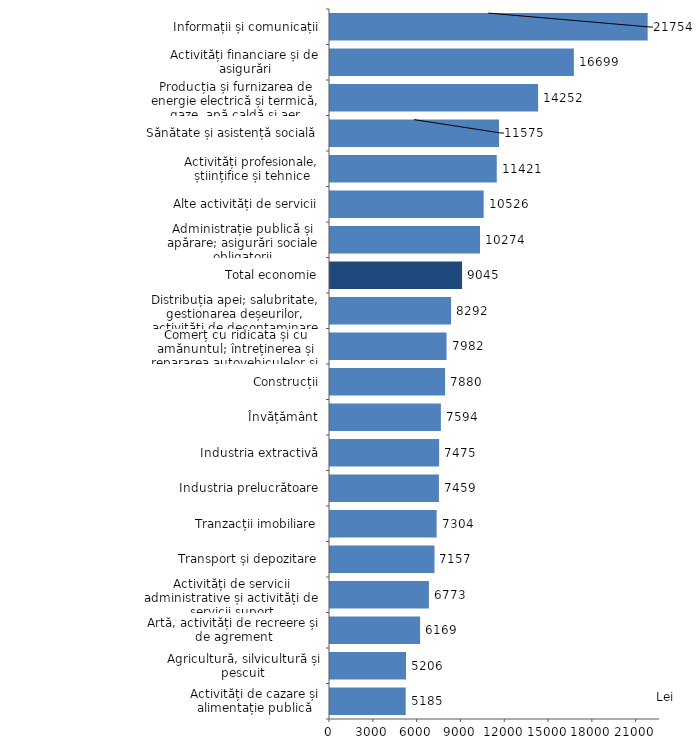
| Category | Series 0 |
|---|---|
| Activități de cazare și alimentație publică | 5184.8 |
| Agricultură, silvicultură și pescuit | 5206.4 |
| Artă, activități de recreere și de agrement | 6169.3 |
| Activități de servicii administrative și activități de servicii suport | 6773 |
| Transport și depozitare | 7156.5 |
| Tranzacții imobiliare | 7304.3 |
| Industria prelucrătoare | 7459.1 |
| Industria extractivă | 7474.5 |
| Învățământ | 7593.7 |
| Construcții | 7880.2 |
| Comerț cu ridicata și cu amănuntul; întreținerea și repararea autovehiculelor și a motocicletelor | 7982.3 |
| Distribuția apei; salubritate, gestionarea deșeurilor, activități de decontaminare | 8291.9 |
| Total economie | 9044.5 |
| Administrație publică și apărare; asigurări sociale obligatorii | 10273.5 |
| Alte activități de servicii | 10525.7 |
| Activități profesionale, științifice și tehnice | 11421.3 |
| Sănătate și asistență socială | 11574.7 |
| Producția și furnizarea de energie electrică și termică, gaze, apă caldă și aer condiționat | 14251.8 |
| Activități financiare și de asigurări | 16698.6 |
| Informații și comunicații | 21753.9 |